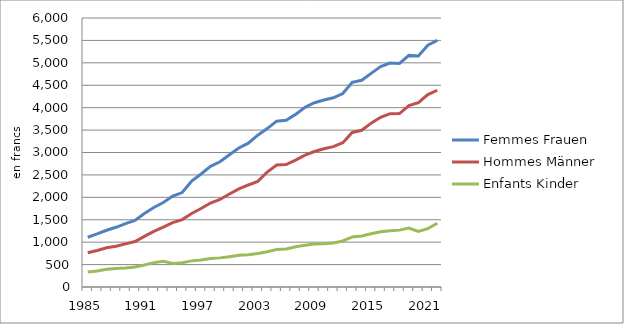
| Category | Femmes | Hommes | Enfants |
|---|---|---|---|
| 1985.0 | 1108.79 | 765.31 | 334.83 |
| 1986.0 | 1182.85 | 813.53 | 357.31 |
| 1987.0 | 1265.89 | 875.88 | 396.72 |
| 1988.0 | 1331.53 | 909.01 | 411.1 |
| 1989.0 | 1412.46 | 961.47 | 422.35 |
| 1990.0 | 1486.52 | 1015.28 | 446.03 |
| 1991.0 | 1639.22 | 1129.3 | 489.14 |
| 1992.0 | 1773.08 | 1240.56 | 543.54 |
| 1993.0 | 1883.87 | 1335.14 | 575.15 |
| 1994.0 | 2028.52 | 1437.01 | 526.85 |
| 1995.0 | 2106.23 | 1502.84 | 541.11 |
| 1996.0 | 2364.404 | 1640.895 | 582.768 |
| 1997.0 | 2521.347 | 1750.528 | 601.969 |
| 1998.0 | 2691.984 | 1872.832 | 635.031 |
| 1999.0 | 2792.569 | 1952.232 | 649.624 |
| 2000.0 | 2950.963 | 2075.174 | 676.617 |
| 2001.0 | 3101.697 | 2188.098 | 707.344 |
| 2002.0 | 3208.038 | 2275.361 | 721.832 |
| 2003.0 | 3386.375 | 2355.272 | 745.229 |
| 2004.0 | 3533.541 | 2564.07 | 784.913 |
| 2005.0 | 3699.424 | 2722.337 | 837.635 |
| 2006.0 | 3721 | 2730.09 | 846.42 |
| 2007.0 | 3849.89 | 2830.42 | 896.38 |
| 2008.0 | 4007.95 | 2941.83 | 931.27 |
| 2009.0 | 4110.06 | 3022.55 | 961.34 |
| 2010.0 | 4171 | 3082.02 | 962.231 |
| 2011.0 | 4219.3 | 3131.72 | 982.33 |
| 2012.0 | 4314.69 | 3218.82 | 1026.61 |
| 2013.0 | 4564.35 | 3448.04 | 1115.68 |
| 2014.0 | 4610.761 | 3495.75 | 1138.098 |
| 2015.0 | 4764.984 | 3654.413 | 1186.15 |
| 2016.0 | 4918.244 | 3785.361 | 1230.205 |
| 2017.0 | 4996.566 | 3866.537 | 1256.521 |
| 2018.0 | 4985.144 | 3869.278 | 1268.583 |
| 2019.0 | 5165.918 | 4047.582 | 1315.59 |
| 2020.0 | 5154.971 | 4113.683 | 1241 |
| 2021.0 | 5393.418 | 4290.987 | 1301.961 |
| 2022.0 | 5500.837 | 4388.632 | 1421.212 |